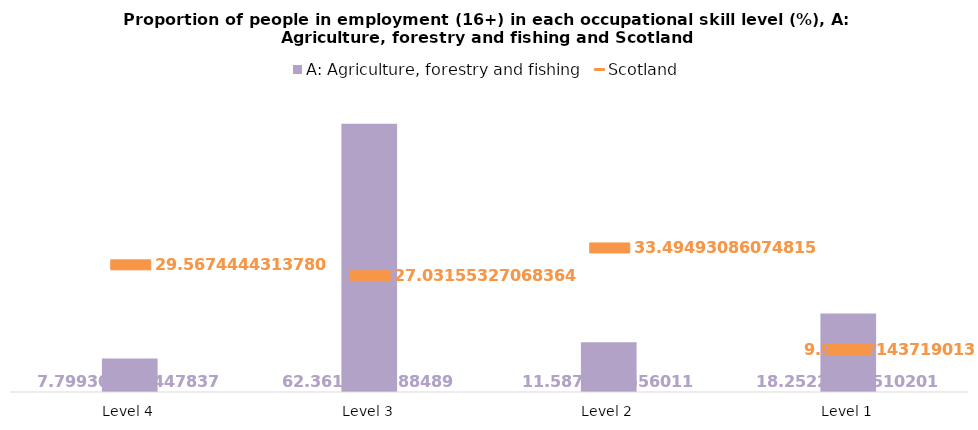
| Category | A: Agriculture, forestry and fishing |
|---|---|
| Level 4 | 7.799 |
| Level 3 | 62.361 |
| Level 2 | 11.587 |
| Level 1 | 18.252 |